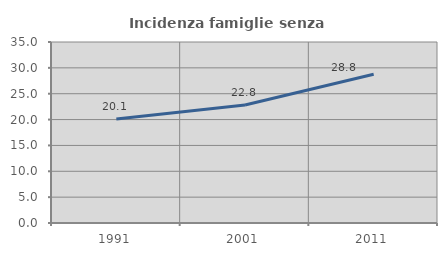
| Category | Incidenza famiglie senza nuclei |
|---|---|
| 1991.0 | 20.096 |
| 2001.0 | 22.822 |
| 2011.0 | 28.778 |